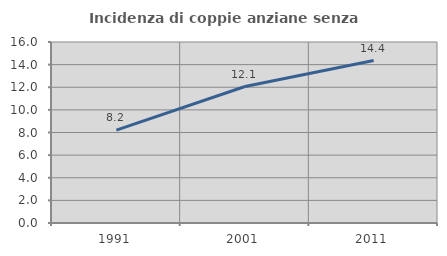
| Category | Incidenza di coppie anziane senza figli  |
|---|---|
| 1991.0 | 8.207 |
| 2001.0 | 12.063 |
| 2011.0 | 14.359 |